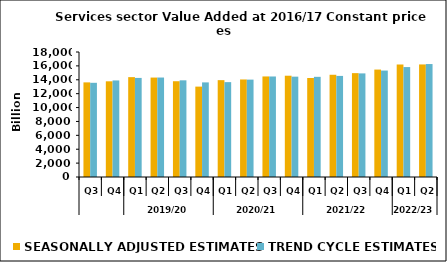
| Category | SEASONALLY ADJUSTED ESTIMATES | TREND CYCLE ESTIMATES |
|---|---|---|
| 0 | 13625.705 | 13564.063 |
| 1 | 13778.793 | 13904.42 |
| 2 | 14380.371 | 14267.76 |
| 3 | 14318.282 | 14324.217 |
| 4 | 13791.006 | 13921.26 |
| 5 | 13015.446 | 13623.449 |
| 6 | 13946.075 | 13660.53 |
| 7 | 14043.549 | 14023.027 |
| 8 | 14479.076 | 14474.576 |
| 9 | 14584.65 | 14449.384 |
| 10 | 14257.073 | 14423.668 |
| 11 | 14721.104 | 14556.749 |
| 12 | 14955.812 | 14919.343 |
| 13 | 15471.198 | 15326.371 |
| 14 | 16199.839 | 15829.792 |
| 15 | 16208.015 | 16266.065 |